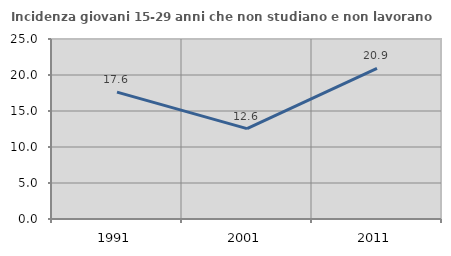
| Category | Incidenza giovani 15-29 anni che non studiano e non lavorano  |
|---|---|
| 1991.0 | 17.629 |
| 2001.0 | 12.552 |
| 2011.0 | 20.93 |